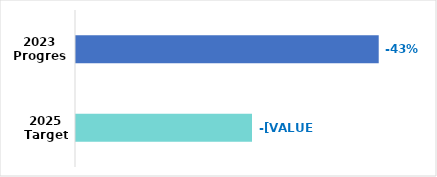
| Category | Series 0 |
|---|---|
| 2023 Progress | 0.43 |
| 2025 Target | 0.25 |